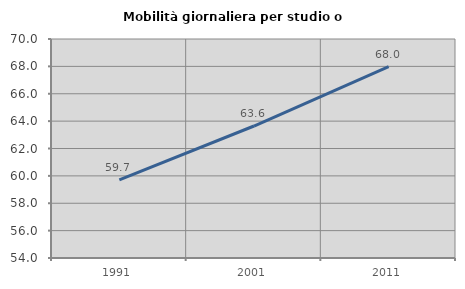
| Category | Mobilità giornaliera per studio o lavoro |
|---|---|
| 1991.0 | 59.715 |
| 2001.0 | 63.644 |
| 2011.0 | 67.989 |